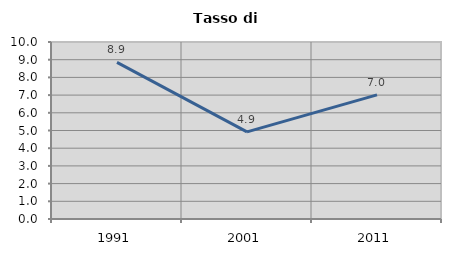
| Category | Tasso di disoccupazione   |
|---|---|
| 1991.0 | 8.852 |
| 2001.0 | 4.92 |
| 2011.0 | 7.013 |